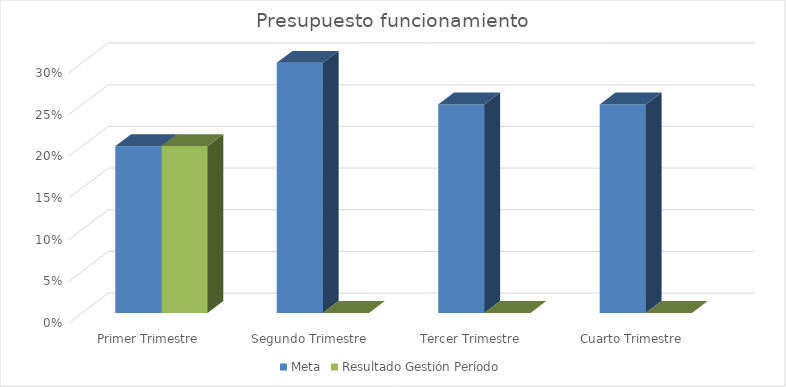
| Category | Meta | Resultado Gestión Período |
|---|---|---|
| Primer Trimestre | 0.2 | 0.2 |
| Segundo Trimestre | 0.3 | 0 |
| Tercer Trimestre | 0.25 | 0 |
| Cuarto Trimestre | 0.25 | 0 |